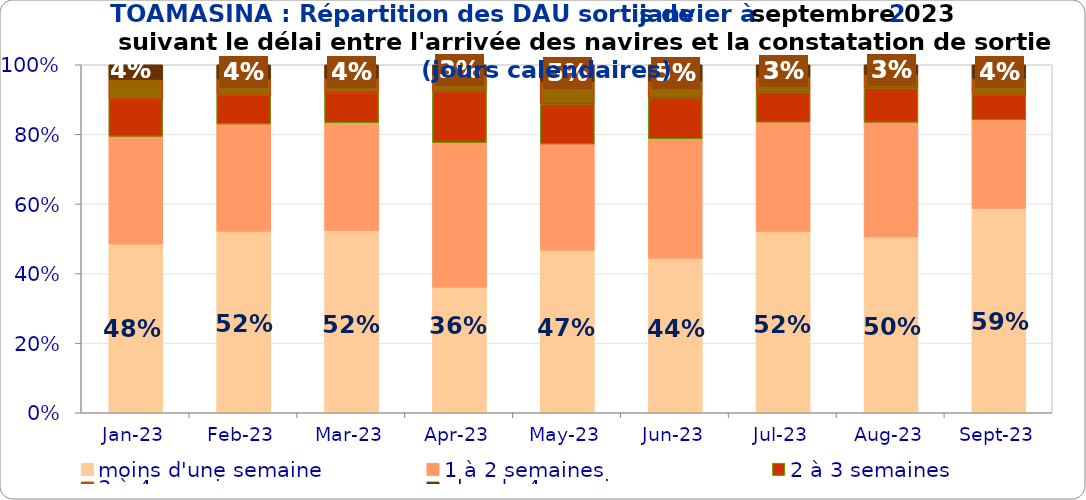
| Category | moins d'une semaine | 1 à 2 semaines | 2 à 3 semaines | 3 à 4 semaines | plus de 4 semaines |
|---|---|---|---|---|---|
| 2023-01-01 | 0.485 | 0.31 | 0.107 | 0.057 | 0.042 |
| 2023-02-01 | 0.521 | 0.309 | 0.083 | 0.047 | 0.041 |
| 2023-03-01 | 0.524 | 0.309 | 0.086 | 0.041 | 0.039 |
| 2023-04-01 | 0.361 | 0.415 | 0.147 | 0.046 | 0.03 |
| 2023-05-01 | 0.467 | 0.305 | 0.115 | 0.064 | 0.049 |
| 2023-06-01 | 0.444 | 0.343 | 0.118 | 0.048 | 0.047 |
| 2023-07-01 | 0.521 | 0.314 | 0.087 | 0.044 | 0.034 |
| 2023-08-01 | 0.505 | 0.33 | 0.098 | 0.04 | 0.028 |
| 2023-09-01 | 0.587 | 0.255 | 0.071 | 0.048 | 0.039 |